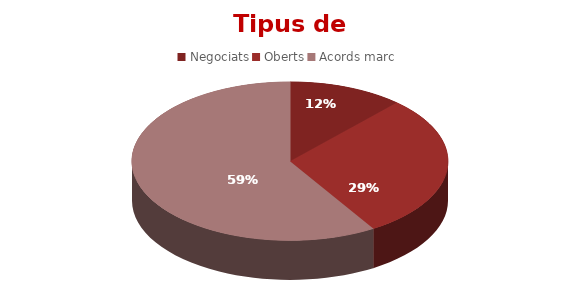
| Category | Series 0 |
|---|---|
| Negociats | 2 |
| Oberts | 5 |
| Acords marc | 10 |